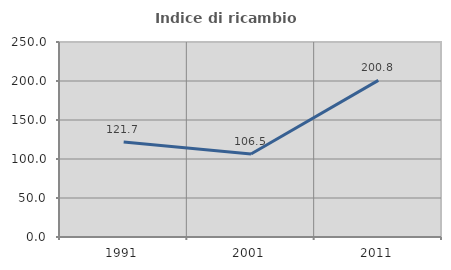
| Category | Indice di ricambio occupazionale  |
|---|---|
| 1991.0 | 121.705 |
| 2001.0 | 106.452 |
| 2011.0 | 200.813 |